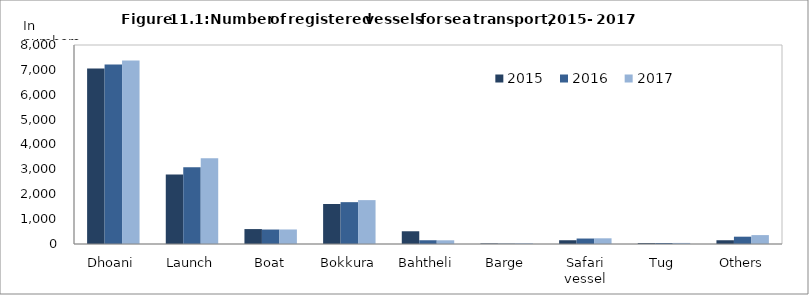
| Category | 2015  | 2016  | 2017  |
|---|---|---|---|
| Dhoani | 7057 | 7220 | 7374 |
| Launch | 2794 | 3081 | 3447 |
| Boat | 600 | 582 | 584 |
| Bokkura | 1608 | 1682 | 1764 |
| Bahtheli | 512 | 151 | 149 |
| Barge | 21 | 14 | 28 |
| Safari vessel | 151 | 220 | 229 |
| Tug | 36 | 40 | 43 |
| Others | 151 | 294 | 358 |